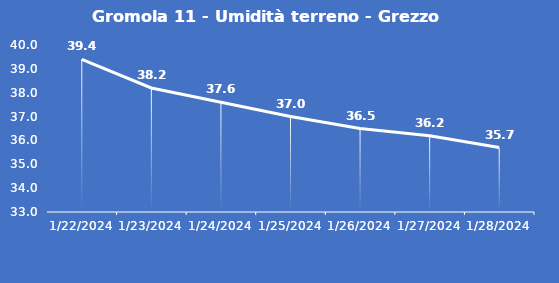
| Category | Gromola 11 - Umidità terreno - Grezzo (%VWC) |
|---|---|
| 1/22/24 | 39.4 |
| 1/23/24 | 38.2 |
| 1/24/24 | 37.6 |
| 1/25/24 | 37 |
| 1/26/24 | 36.5 |
| 1/27/24 | 36.2 |
| 1/28/24 | 35.7 |